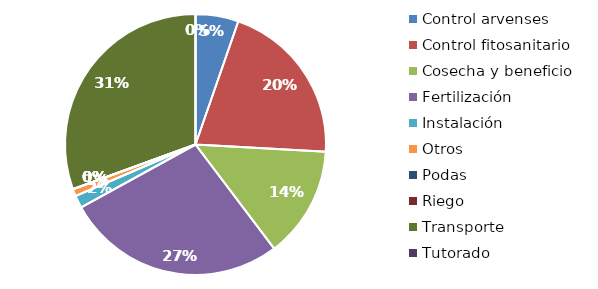
| Category | Valor |
|---|---|
| Control arvenses | 2257833.333 |
| Control fitosanitario | 8720214.667 |
| Cosecha y beneficio | 5867398.653 |
| Fertilización | 11577583.333 |
| Instalación | 659096.412 |
| Otros | 379340 |
| Podas | 0 |
| Riego | 0 |
| Transporte | 12967844 |
| Tutorado | 0 |